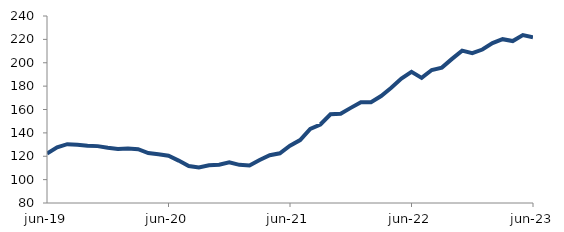
| Category | Series 0 |
|---|---|
| 2019-06-01 | 122.365 |
| 2019-07-01 | 127.653 |
| 2019-08-01 | 130.323 |
| 2019-09-01 | 129.814 |
| 2019-10-01 | 129.013 |
| 2019-11-01 | 128.663 |
| 2019-12-01 | 127.192 |
| 2020-01-01 | 126.144 |
| 2020-02-01 | 126.638 |
| 2020-03-01 | 125.992 |
| 2020-04-01 | 122.726 |
| 2020-05-01 | 121.669 |
| 2020-06-01 | 120.485 |
| 2020-07-01 | 116.268 |
| 2020-08-01 | 111.597 |
| 2020-09-01 | 110.39 |
| 2020-10-01 | 112.229 |
| 2020-11-01 | 112.769 |
| 2020-12-01 | 114.741 |
| 2021-01-01 | 112.625 |
| 2021-02-01 | 112.14 |
| 2021-03-01 | 116.74 |
| 2021-04-01 | 120.911 |
| 2021-05-01 | 122.536 |
| 2021-06-01 | 128.968 |
| 2021-07-01 | 133.864 |
| 2021-08-01 | 143.384 |
| 2021-09-01 | 147.196 |
| 2021-10-01 | 155.883 |
| 2021-11-01 | 156.426 |
| 2021-12-01 | 161.4 |
| 2022-01-01 | 166.276 |
| 2022-02-01 | 166.219 |
| 2022-03-01 | 171.531 |
| 2022-04-01 | 178.644 |
| 2022-05-01 | 186.465 |
| 2022-06-01 | 192.187 |
| 2022-07-01 | 187.044 |
| 2022-08-01 | 193.806 |
| 2022-09-01 | 195.846 |
| 2022-10-01 | 203.287 |
| 2022-11-01 | 210.344 |
| 2022-12-01 | 208.16 |
| 2023-01-01 | 211.29 |
| 2023-02-01 | 216.772 |
| 2023-03-01 | 220.156 |
| 2023-04-01 | 218.537 |
| 2023-05-01 | 223.702 |
| 2023-06-01 | 221.798 |